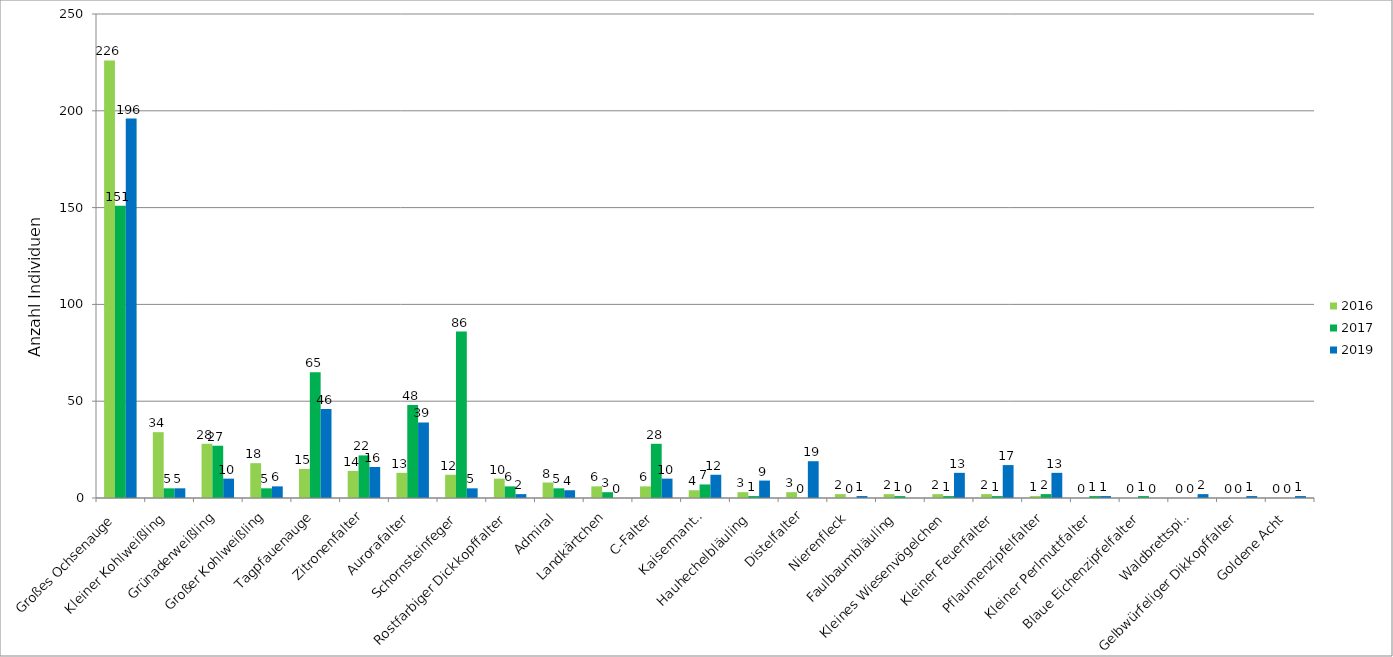
| Category | 2016 | 2017 | 2019 |
|---|---|---|---|
| Großes Ochsenauge | 226 | 151 | 196 |
| Kleiner Kohlweißling | 34 | 5 | 5 |
| Grünaderweißling | 28 | 27 | 10 |
| Großer Kohlweißling | 18 | 5 | 6 |
| Tagpfauenauge | 15 | 65 | 46 |
| Zitronenfalter | 14 | 22 | 16 |
| Aurorafalter | 13 | 48 | 39 |
| Schornsteinfeger | 12 | 86 | 5 |
| Rostfarbiger Dickkopffalter | 10 | 6 | 2 |
| Admiral | 8 | 5 | 4 |
| Landkärtchen | 6 | 3 | 0 |
| C-Falter | 6 | 28 | 10 |
| Kaisermantel | 4 | 7 | 12 |
| Hauhechelbläuling | 3 | 1 | 9 |
| Distelfalter | 3 | 0 | 19 |
| Nierenfleck | 2 | 0 | 1 |
| Faulbaumbläuling | 2 | 1 | 0 |
| Kleines Wiesenvögelchen | 2 | 1 | 13 |
| Kleiner Feuerfalter | 2 | 1 | 17 |
| Pflaumenzipfelfalter | 1 | 2 | 13 |
| Kleiner Perlmuttfalter | 0 | 1 | 1 |
| Blaue Eichenzipfelfalter | 0 | 1 | 0 |
| Waldbrettspiel | 0 | 0 | 2 |
| Gelbwürfeliger Dikkopffalter | 0 | 0 | 1 |
| Goldene Acht | 0 | 0 | 1 |